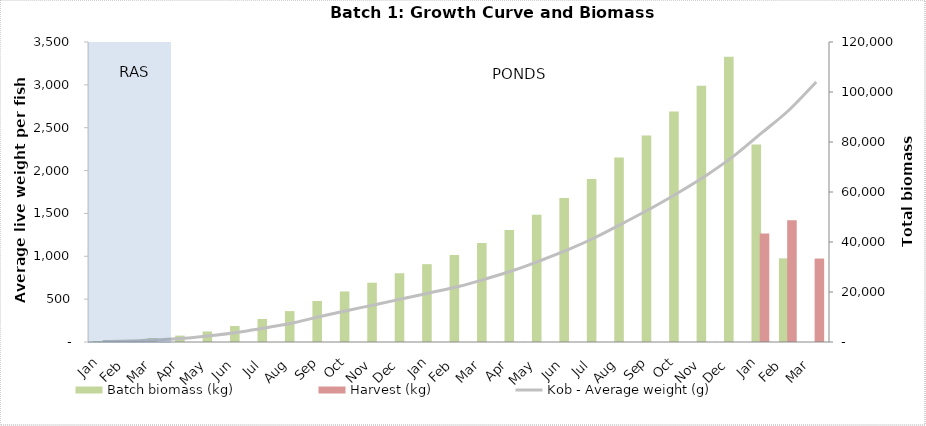
| Category | Batch biomass (kg) | Harvest (kg) |
|---|---|---|
| 0 | 353.244 | 0 |
| 1 | 708.475 | 0 |
| 2 | 1579.951 | 0 |
| 3 | 2556.157 | 0 |
| 4 | 4208.112 | 0 |
| 5 | 6385.462 | 0 |
| 6 | 9209.167 | 0 |
| 7 | 12353.228 | 0 |
| 8 | 16413.367 | 0 |
| 9 | 20215.071 | 0 |
| 10 | 23712.221 | 0 |
| 11 | 27502.685 | 0 |
| 12 | 31140.348 | 0 |
| 13 | 34831.074 | 0 |
| 14 | 39593.572 | 0 |
| 15 | 44819.588 | 0 |
| 16 | 50948.899 | 0 |
| 17 | 57562.815 | 0 |
| 18 | 65176.402 | 0 |
| 19 | 73797.005 | 0 |
| 20 | 82623.614 | 0 |
| 21 | 92175.385 | 0 |
| 22 | 102462.531 | 0 |
| 23 | 114109.354 | 0 |
| 24 | 79039.898 | 43435.117 |
| 25 | 33451.063 | 48733.871 |
| 26 | 0 | 33384.161 |